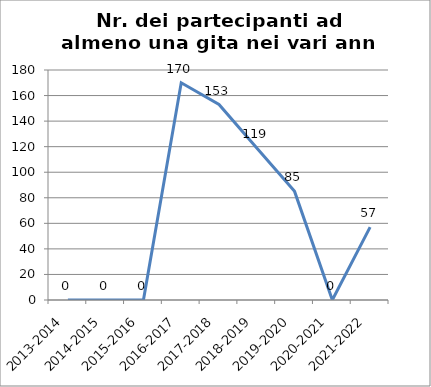
| Category | Nr. Partecipanti ad almeno una Gita |
|---|---|
| 2013-2014 | 0 |
| 2014-2015 | 0 |
| 2015-2016 | 0 |
| 2016-2017 | 170 |
| 2017-2018 | 153 |
| 2018-2019 | 119 |
| 2019-2020 | 85 |
| 2020-2021 | 0 |
| 2021-2022 | 57 |